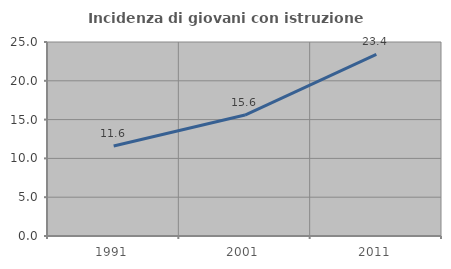
| Category | Incidenza di giovani con istruzione universitaria |
|---|---|
| 1991.0 | 11.594 |
| 2001.0 | 15.584 |
| 2011.0 | 23.404 |